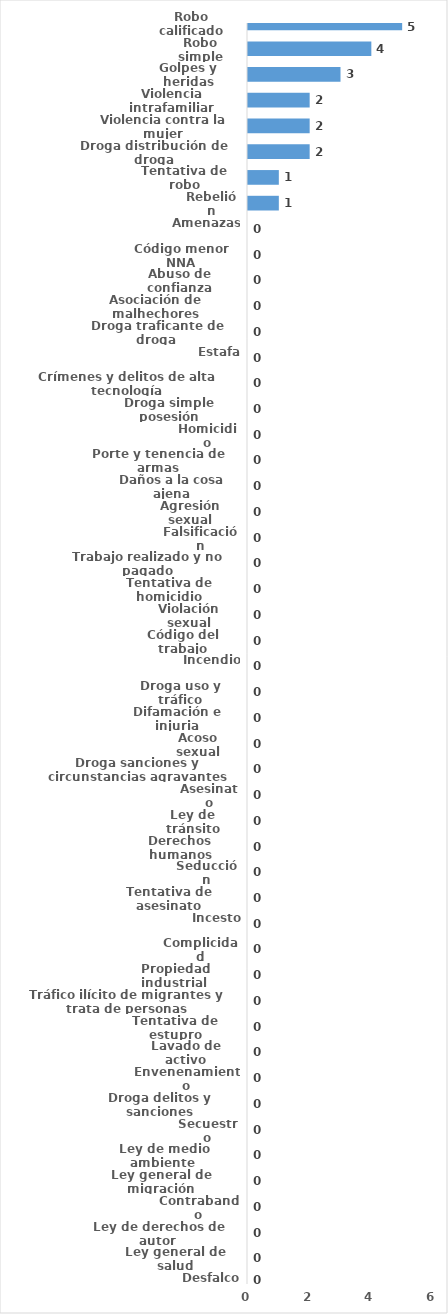
| Category | Series 0 |
|---|---|
| Robo calificado | 5 |
| Robo simple | 4 |
| Golpes y heridas | 3 |
| Violencia intrafamiliar | 2 |
| Violencia contra la mujer | 2 |
| Droga distribución de droga | 2 |
| Tentativa de robo | 1 |
| Rebelión | 1 |
| Amenazas | 0 |
| Código menor NNA | 0 |
| Abuso de confianza | 0 |
| Asociación de malhechores | 0 |
| Droga traficante de droga  | 0 |
| Estafa | 0 |
| Crímenes y delitos de alta tecnología | 0 |
| Droga simple posesión | 0 |
| Homicidio | 0 |
| Porte y tenencia de armas | 0 |
| Daños a la cosa ajena | 0 |
| Agresión sexual | 0 |
| Falsificación | 0 |
| Trabajo realizado y no pagado | 0 |
| Tentativa de homicidio | 0 |
| Violación sexual | 0 |
| Código del trabajo | 0 |
| Incendio | 0 |
| Droga uso y tráfico | 0 |
| Difamación e injuria | 0 |
| Acoso sexual | 0 |
| Droga sanciones y circunstancias agravantes | 0 |
| Asesinato | 0 |
| Ley de tránsito | 0 |
| Derechos humanos | 0 |
| Seducción | 0 |
| Tentativa de asesinato | 0 |
| Incesto | 0 |
| Complicidad | 0 |
| Propiedad industrial  | 0 |
| Tráfico ilícito de migrantes y trata de personas | 0 |
| Tentativa de estupro | 0 |
| Lavado de activo | 0 |
| Envenenamiento | 0 |
| Droga delitos y sanciones | 0 |
| Secuestro | 0 |
| Ley de medio ambiente  | 0 |
| Ley general de migración | 0 |
| Contrabando | 0 |
| Ley de derechos de autor  | 0 |
| Ley general de salud | 0 |
| Desfalco | 0 |